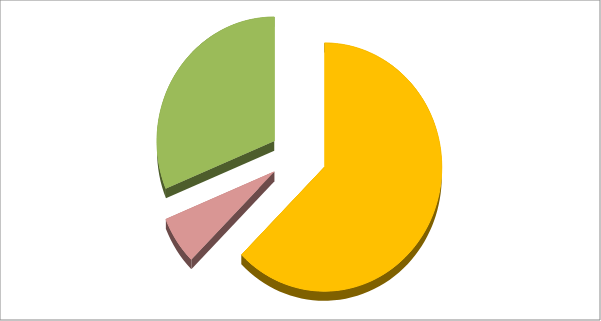
| Category | Series 0 |
|---|---|
| Control group (normal air) | 5 |
| Variable 1 .e.g Exhaled air | 0.5 |
| Variable 2 e.g. Burning candle | 2.5 |